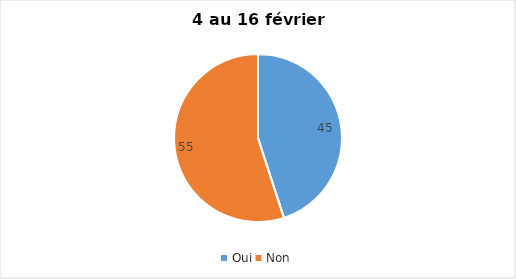
| Category | Series 0 |
|---|---|
| Oui | 45 |
| Non | 55 |